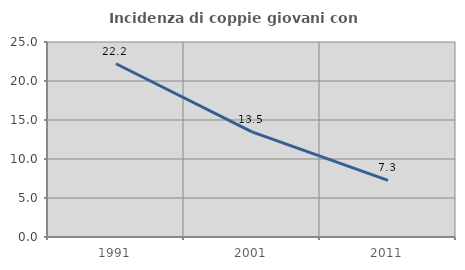
| Category | Incidenza di coppie giovani con figli |
|---|---|
| 1991.0 | 22.208 |
| 2001.0 | 13.472 |
| 2011.0 | 7.261 |